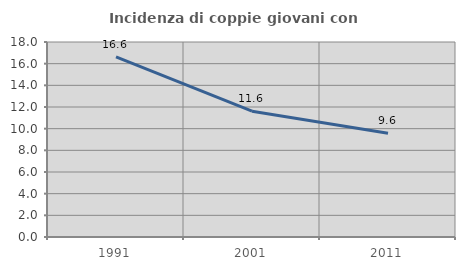
| Category | Incidenza di coppie giovani con figli |
|---|---|
| 1991.0 | 16.622 |
| 2001.0 | 11.616 |
| 2011.0 | 9.572 |